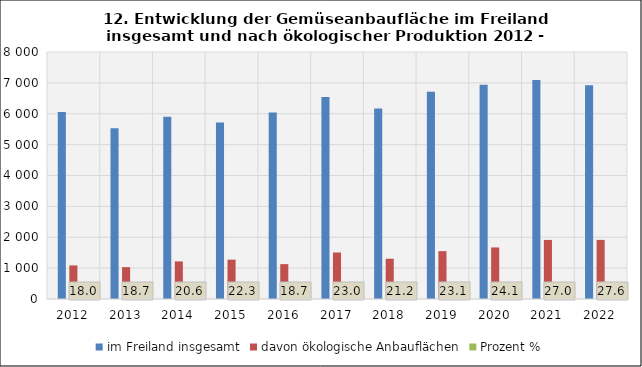
| Category | im Freiland insgesamt | davon ökologische Anbauflächen | Prozent % |
|---|---|---|---|
| 2012.0 | 6058.2 | 1088.1 | 17.961 |
| 2013.0 | 5528.1 | 1031.9 | 18.666 |
| 2014.0 | 5904 | 1218.2 | 20.633 |
| 2015.0 | 5720 | 1274.2 | 22.276 |
| 2016.0 | 6043.5 | 1129.1 | 18.683 |
| 2017.0 | 6539.1 | 1506.3 | 23.035 |
| 2018.0 | 6166.7 | 1304.6 | 21.156 |
| 2019.0 | 6708.6 | 1550.3 | 23.109 |
| 2020.0 | 6936.8 | 1669.5 | 24.067 |
| 2021.0 | 7090.9 | 1912.9 | 26.977 |
| 2022.0 | 6923.5 | 1914.3 | 27.649 |